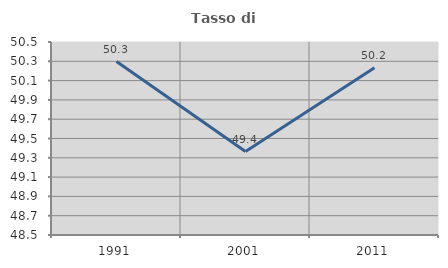
| Category | Tasso di occupazione   |
|---|---|
| 1991.0 | 50.297 |
| 2001.0 | 49.364 |
| 2011.0 | 50.233 |